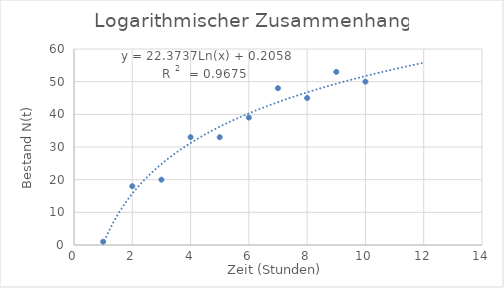
| Category | Series 0 |
|---|---|
| 1.0 | 1 |
| 2.0 | 18 |
| 3.0 | 20 |
| 4.0 | 33 |
| 5.0 | 33 |
| 6.0 | 39 |
| 7.0 | 48 |
| 8.0 | 45 |
| 9.0 | 53 |
| 10.0 | 50 |